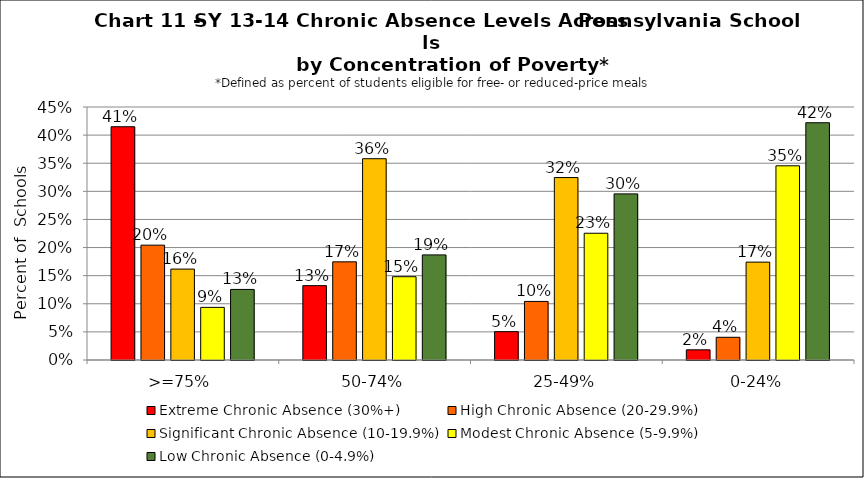
| Category | Extreme Chronic Absence (30%+) | High Chronic Absence (20-29.9%) | Significant Chronic Absence (10-19.9%) | Modest Chronic Absence (5-9.9%) | Low Chronic Absence (0-4.9%) |
|---|---|---|---|---|---|
| 0 | 0.415 | 0.204 | 0.162 | 0.094 | 0.126 |
| 1 | 0.132 | 0.175 | 0.358 | 0.148 | 0.187 |
| 2 | 0.05 | 0.104 | 0.325 | 0.225 | 0.295 |
| 3 | 0.018 | 0.04 | 0.174 | 0.345 | 0.422 |